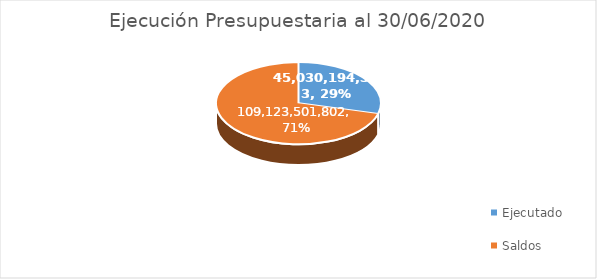
| Category | Series 0 |
|---|---|
| Ejecutado | 45030194353 |
| Saldos | 109123501802 |